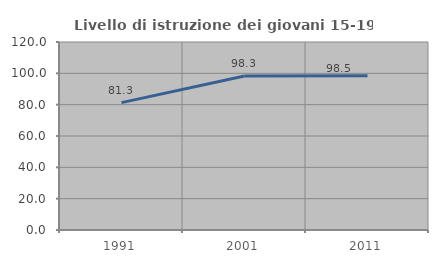
| Category | Livello di istruzione dei giovani 15-19 anni |
|---|---|
| 1991.0 | 81.301 |
| 2001.0 | 98.333 |
| 2011.0 | 98.529 |